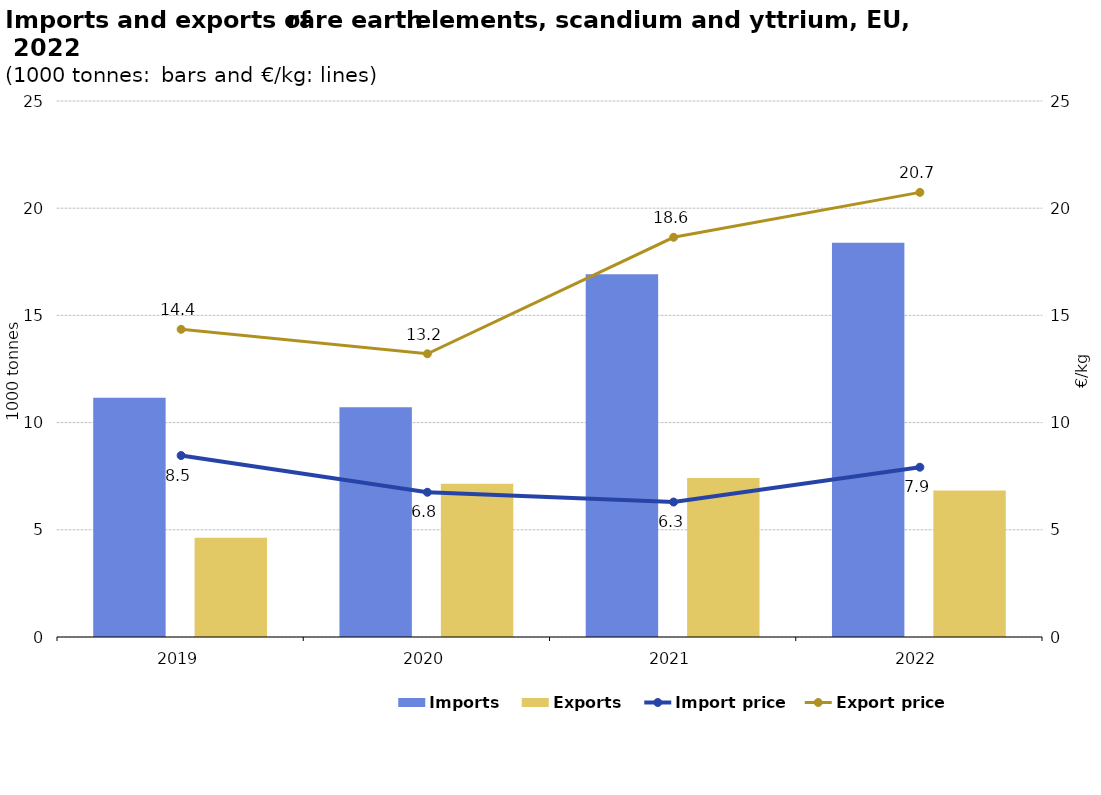
| Category | Imports | Exports |
|---|---|---|
| 2019.0 | 11.164 | 4.633 |
| 2020.0 | 10.711 | 7.146 |
| 2021.0 | 16.918 | 7.414 |
| 2022.0 | 18.388 | 6.829 |